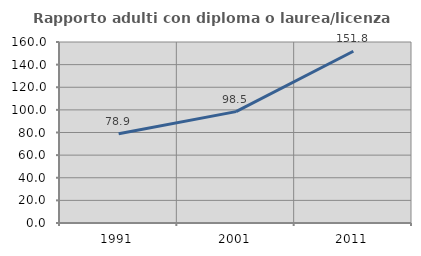
| Category | Rapporto adulti con diploma o laurea/licenza media  |
|---|---|
| 1991.0 | 78.902 |
| 2001.0 | 98.462 |
| 2011.0 | 151.803 |